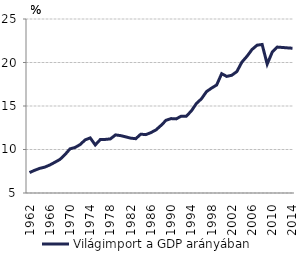
| Category | Világimport a GDP arányában |
|---|---|
| 1962.0 | 7.35 |
| 1963.0 | 7.605 |
| 1964.0 | 7.829 |
| 1965.0 | 7.972 |
| 1966.0 | 8.215 |
| 1967.0 | 8.529 |
| 1968.0 | 8.854 |
| 1969.0 | 9.405 |
| 1970.0 | 10.071 |
| 1971.0 | 10.231 |
| 1972.0 | 10.564 |
| 1973.0 | 11.105 |
| 1974.0 | 11.333 |
| 1975.0 | 10.524 |
| 1976.0 | 11.147 |
| 1977.0 | 11.16 |
| 1978.0 | 11.219 |
| 1979.0 | 11.681 |
| 1980.0 | 11.597 |
| 1981.0 | 11.457 |
| 1982.0 | 11.306 |
| 1983.0 | 11.24 |
| 1984.0 | 11.761 |
| 1985.0 | 11.71 |
| 1986.0 | 11.941 |
| 1987.0 | 12.249 |
| 1988.0 | 12.765 |
| 1989.0 | 13.358 |
| 1990.0 | 13.552 |
| 1991.0 | 13.519 |
| 1992.0 | 13.835 |
| 1993.0 | 13.828 |
| 1994.0 | 14.428 |
| 1995.0 | 15.291 |
| 1996.0 | 15.829 |
| 1997.0 | 16.654 |
| 1998.0 | 17.059 |
| 1999.0 | 17.412 |
| 2000.0 | 18.713 |
| 2001.0 | 18.401 |
| 2002.0 | 18.536 |
| 2003.0 | 18.958 |
| 2004.0 | 20.049 |
| 2005.0 | 20.713 |
| 2006.0 | 21.493 |
| 2007.0 | 21.99 |
| 2008.0 | 22.072 |
| 2009.0 | 19.812 |
| 2010.0 | 21.196 |
| 2011.0 | 21.773 |
| 2012.0 | 21.728 |
| 2013.0 | 21.681 |
| 2014.0 | 21.639 |